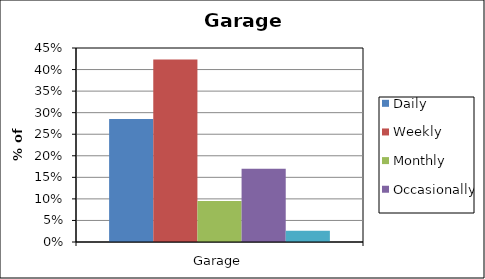
| Category | Daily | Weekly | Monthly | Occasionally | Never |
|---|---|---|---|---|---|
| Garage | 0.285 | 0.423 | 0.095 | 0.17 | 0.026 |